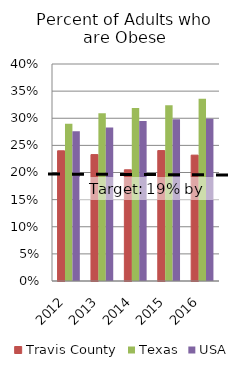
| Category | Travis County | Texas | USA |
|---|---|---|---|
| 2012.0 | 0.24 | 0.29 | 0.276 |
| 2013.0 | 0.233 | 0.309 | 0.283 |
| 2014.0 | 0.205 | 0.319 | 0.295 |
| 2015.0 | 0.24 | 0.324 | 0.298 |
| 2016.0 | 0.232 | 0.336 | 0.299 |